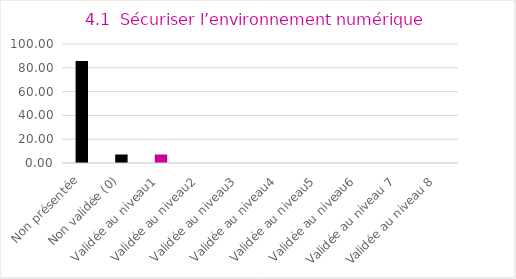
| Category | Series 0 |
|---|---|
| Non présentée | 85.714 |
| Non validée (0) | 7.143 |
| Validée au niveau1 | 7.143 |
| Validée au niveau2 | 0 |
| Validée au niveau3 | 0 |
| Validée au niveau4 | 0 |
| Validée au niveau5 | 0 |
| Validée au niveau6 | 0 |
| Validée au niveau 7 | 0 |
| Validée au niveau 8 | 0 |